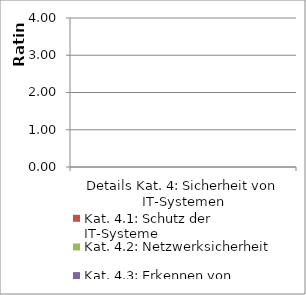
| Category | Kat. 4.1: Schutz der IT-Systeme | Kat. 4.2: Netzwerksicherheit | Kat. 4.3: Erkennen von Angriffen |
|---|---|---|---|
| Details Kat. 4: Sicherheit von IT-Systemen | 0 | 0 | 0 |